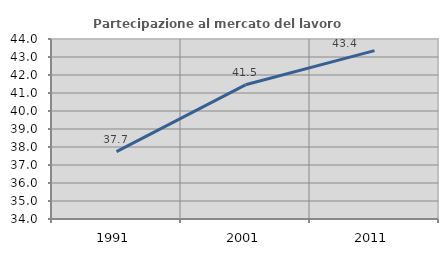
| Category | Partecipazione al mercato del lavoro  femminile |
|---|---|
| 1991.0 | 37.743 |
| 2001.0 | 41.455 |
| 2011.0 | 43.357 |